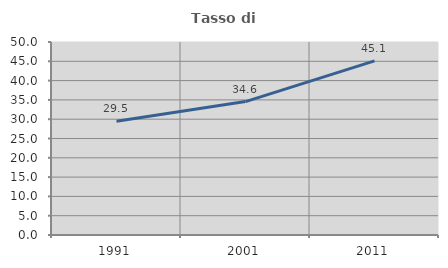
| Category | Tasso di occupazione   |
|---|---|
| 1991.0 | 29.469 |
| 2001.0 | 34.559 |
| 2011.0 | 45.098 |